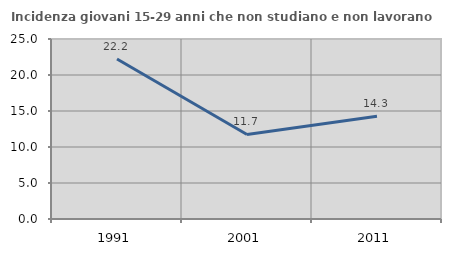
| Category | Incidenza giovani 15-29 anni che non studiano e non lavorano  |
|---|---|
| 1991.0 | 22.222 |
| 2001.0 | 11.74 |
| 2011.0 | 14.286 |